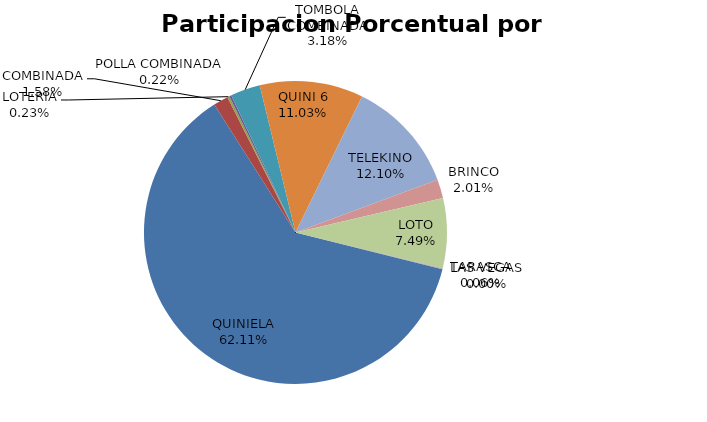
| Category | Series 0 |
|---|---|
| QUINIELA | 2062681 |
| COMBINADA | 52551 |
| LOTERIA | 7606 |
| POLLA COMBINADA | 7177 |
| TOMBOLA COMBINADA | 105484 |
| QUINI 6 | 366404 |
| TELEKINO | 401786 |
| BRINCO | 66815 |
| LOTO | 248578 |
| TARASCA | 1909 |
| LAS VEGAS | 0 |